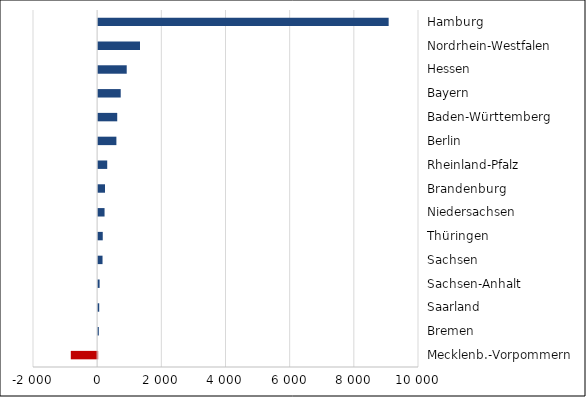
| Category | Series 0 |
|---|---|
| Mecklenb.-Vorpommern | -822 |
| Bremen | 20 |
| Saarland | 33 |
| Sachsen-Anhalt | 45 |
| Sachsen | 136 |
| Thüringen | 143 |
| Niedersachsen | 199 |
| Brandenburg | 213 |
| Rheinland-Pfalz | 282 |
| Berlin | 568 |
| Baden-Württemberg | 594 |
| Bayern | 703 |
| Hessen | 890 |
| Nordrhein-Westfalen | 1304 |
| Hamburg | 9054 |